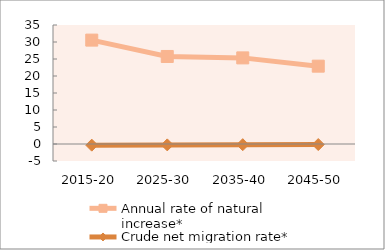
| Category | Annual rate of natural increase* | Crude net migration rate* |
|---|---|---|
| 2015-20 | 30.552 | -0.342 |
| 2025-30 | 25.743 | -0.26 |
| 2035-40 | 25.327 | -0.202 |
| 2045-50 | 22.894 | -0.158 |